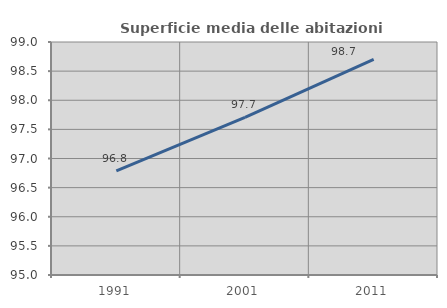
| Category | Superficie media delle abitazioni occupate |
|---|---|
| 1991.0 | 96.789 |
| 2001.0 | 97.705 |
| 2011.0 | 98.703 |